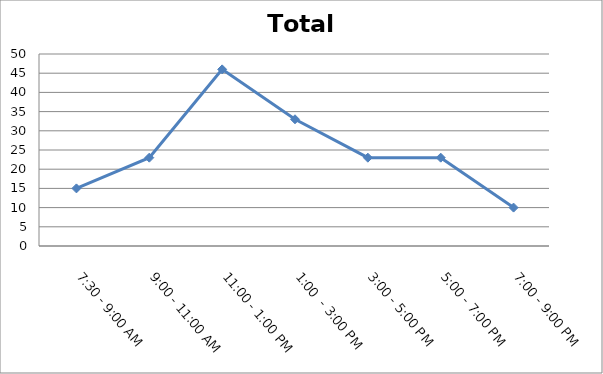
| Category | Total |
|---|---|
| 7:30 - 9:00 AM | 15 |
| 9:00 - 11:00 AM | 23 |
| 11:00 - 1:00 PM | 46 |
| 1:00  - 3:00 PM | 33 |
| 3:00 - 5:00 PM | 23 |
| 5:00 - 7:00 PM | 23 |
| 7:00 - 9:00 PM | 10 |